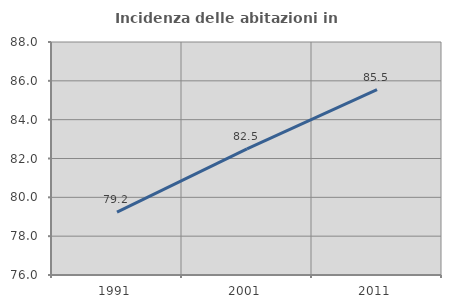
| Category | Incidenza delle abitazioni in proprietà  |
|---|---|
| 1991.0 | 79.236 |
| 2001.0 | 82.496 |
| 2011.0 | 85.545 |